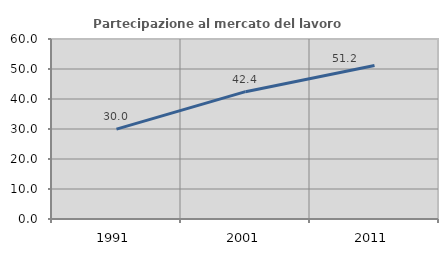
| Category | Partecipazione al mercato del lavoro  femminile |
|---|---|
| 1991.0 | 29.963 |
| 2001.0 | 42.446 |
| 2011.0 | 51.183 |